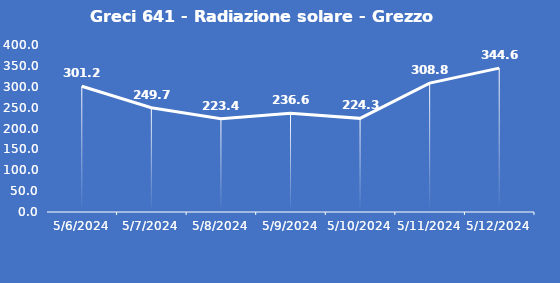
| Category | Greci 641 - Radiazione solare - Grezzo (W/m2) |
|---|---|
| 5/6/24 | 301.2 |
| 5/7/24 | 249.7 |
| 5/8/24 | 223.4 |
| 5/9/24 | 236.6 |
| 5/10/24 | 224.3 |
| 5/11/24 | 308.8 |
| 5/12/24 | 344.6 |